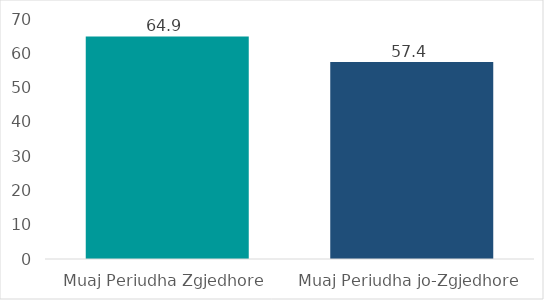
| Category | Mesatarisht Pagesa për Muaj |
|---|---|
| Muaj Periudha Zgjedhore | 64.91 |
| Muaj Periudha jo-Zgjedhore | 57.422 |